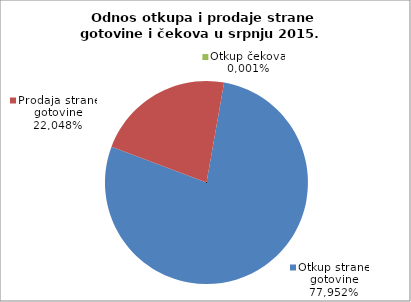
| Category | Otkup strane gotovine |
|---|---|
| 0 | 0.78 |
| 1 | 0.22 |
| 2 | 0 |